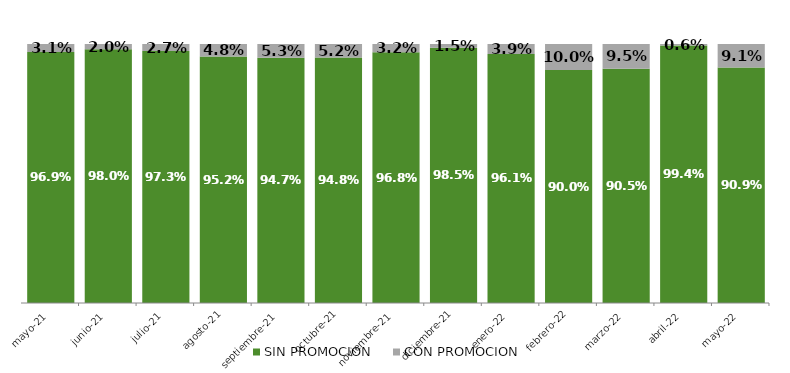
| Category | SIN PROMOCION   | CON PROMOCION   |
|---|---|---|
| 2021-05-01 | 0.969 | 0.031 |
| 2021-06-01 | 0.98 | 0.02 |
| 2021-07-01 | 0.973 | 0.027 |
| 2021-08-01 | 0.952 | 0.048 |
| 2021-09-01 | 0.947 | 0.053 |
| 2021-10-01 | 0.948 | 0.052 |
| 2021-11-01 | 0.968 | 0.032 |
| 2021-12-01 | 0.985 | 0.015 |
| 2022-01-01 | 0.961 | 0.039 |
| 2022-02-01 | 0.9 | 0.1 |
| 2022-03-01 | 0.905 | 0.095 |
| 2022-04-01 | 0.994 | 0.006 |
| 2022-05-01 | 0.909 | 0.091 |